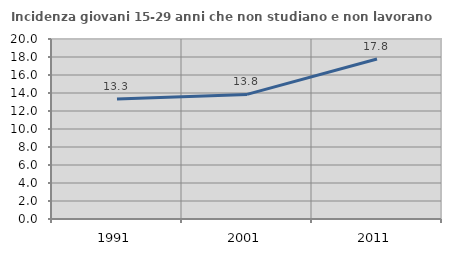
| Category | Incidenza giovani 15-29 anni che non studiano e non lavorano  |
|---|---|
| 1991.0 | 13.333 |
| 2001.0 | 13.846 |
| 2011.0 | 17.778 |